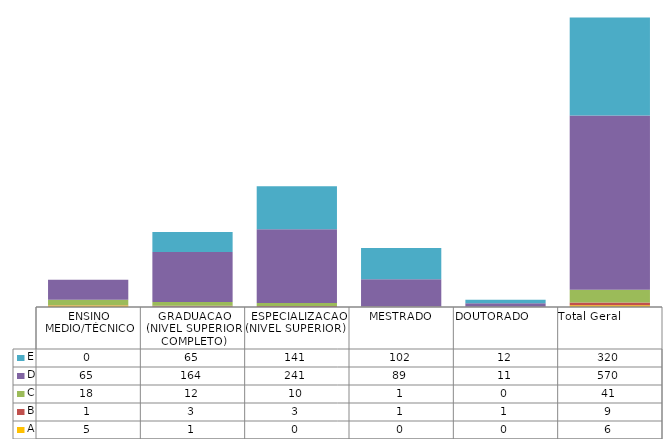
| Category | A | B | C | D | E |
|---|---|---|---|---|---|
| ENSINO MEDIO/TÉCNICO | 5 | 1 | 18 | 65 | 0 |
| GRADUACAO (NIVEL SUPERIOR COMPLETO) | 1 | 3 | 12 | 164 | 65 |
| ESPECIALIZACAO (NIVEL SUPERIOR)   | 0 | 3 | 10 | 241 | 141 |
| MESTRADO | 0 | 1 | 1 | 89 | 102 |
| DOUTORADO                             | 0 | 1 | 0 | 11 | 12 |
| Total Geral                  | 6 | 9 | 41 | 570 | 320 |